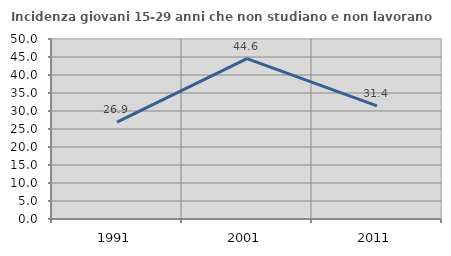
| Category | Incidenza giovani 15-29 anni che non studiano e non lavorano  |
|---|---|
| 1991.0 | 26.904 |
| 2001.0 | 44.565 |
| 2011.0 | 31.446 |